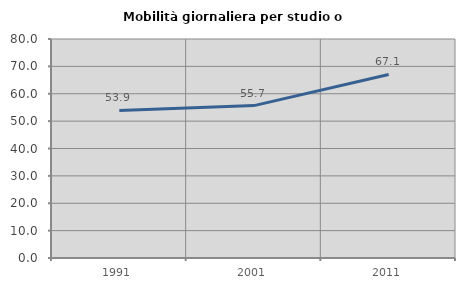
| Category | Mobilità giornaliera per studio o lavoro |
|---|---|
| 1991.0 | 53.886 |
| 2001.0 | 55.67 |
| 2011.0 | 67.059 |